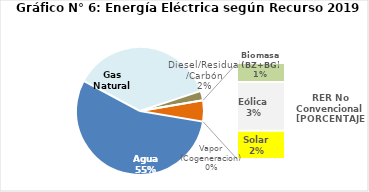
| Category | Series 0 |
|---|---|
| Agua | 2619.716 |
| Gas Natural | 1760.149 |
| Diesel/Residual/Carbón | 114.794 |
| Vapor (Cogeneracion) | 0.384 |
| Biomasa (BZ+BG) | 50.081 |
| Eólica | 129.155 |
| Solar | 75.187 |